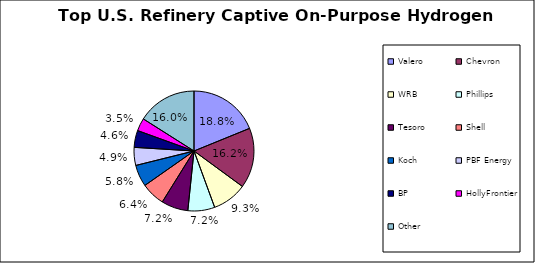
| Category | Series 0 |
|---|---|
| Valero | 0.188 |
| Chevron | 0.162 |
| WRB | 0.093 |
| Phillips | 0.072 |
| Tesoro | 0.072 |
| Shell | 0.064 |
| Koch | 0.058 |
| PBF Energy | 0.049 |
| BP | 0.046 |
| HollyFrontier | 0.035 |
| Other | 0.16 |